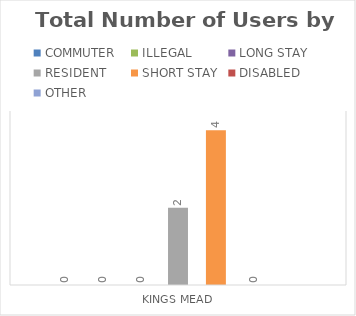
| Category | COMMUTER | ILLEGAL | LONG STAY | RESIDENT | SHORT STAY | DISABLED | OTHER |
|---|---|---|---|---|---|---|---|
| KINGS MEAD | 0 | 0 | 0 | 2 | 4 | 0 | 0 |